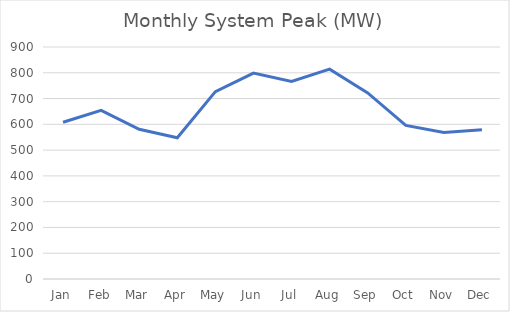
| Category | Monthly System Peak |
|---|---|
| Jan | 608 |
| Feb | 654 |
| Mar | 581 |
| Apr | 548 |
| May | 727 |
| Jun | 799 |
| Jul | 766 |
| Aug | 814 |
| Sep | 722 |
| Oct | 596 |
| Nov | 568 |
| Dec | 579 |